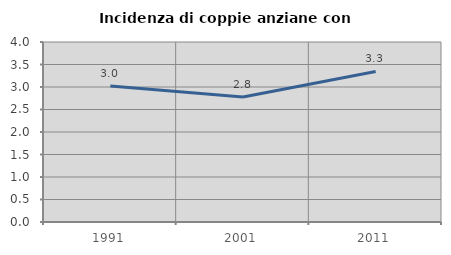
| Category | Incidenza di coppie anziane con figli |
|---|---|
| 1991.0 | 3.021 |
| 2001.0 | 2.778 |
| 2011.0 | 3.346 |